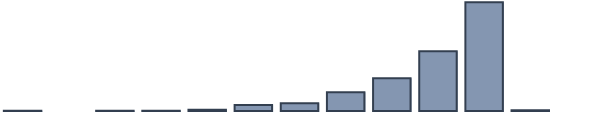
| Category | Series 0 |
|---|---|
| 0 | 0.1 |
| 1 | 0 |
| 2 | 0.1 |
| 3 | 0.1 |
| 4 | 0.5 |
| 5 | 2.5 |
| 6 | 3.3 |
| 7 | 7.9 |
| 8 | 13.9 |
| 9 | 25.3 |
| 10 | 46 |
| 11 | 0.3 |
| 12 | 0 |